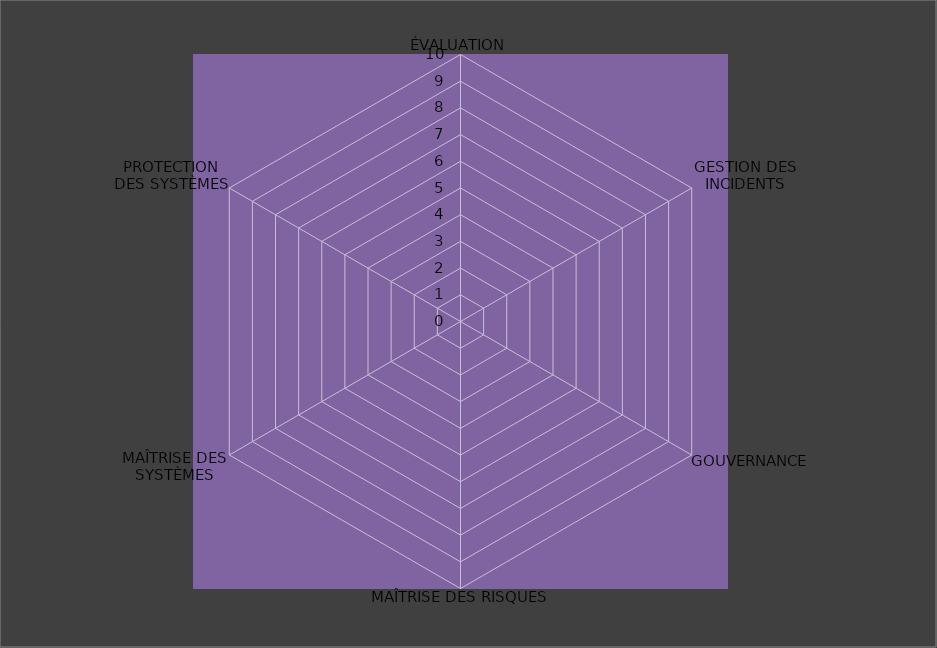
| Category | Année 2020 |
|---|---|
| ÉVALUATION | 0 |
| GESTION DES INCIDENTS | 0 |
| GOUVERNANCE | 0 |
| MAÎTRISE DES RISQUES | 0 |
| MAÎTRISE DES SYSTÈMES | 0 |
| PROTECTION
DES SYSTÈMES | 0 |